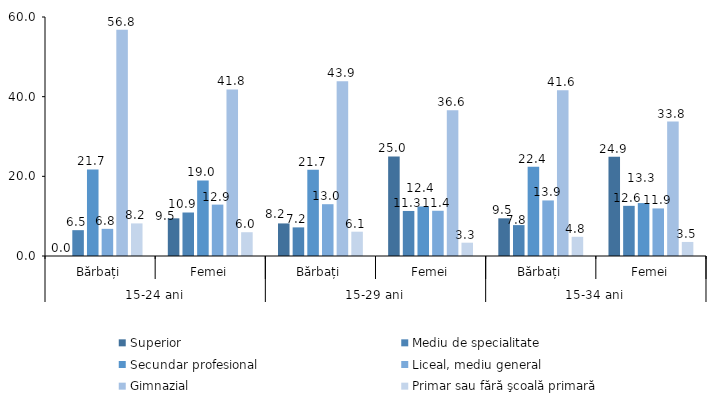
| Category | Superior | Mediu de specialitate | Secundar profesional | Liceal, mediu general | Gimnazial | Primar sau fără şcoală primară |
|---|---|---|---|---|---|---|
| 0 | 0 | 6.484 | 21.739 | 6.818 | 56.776 | 8.183 |
| 1 | 9.457 | 10.919 | 18.954 | 12.9 | 41.801 | 5.969 |
| 2 | 8.178 | 7.186 | 21.676 | 13.005 | 43.856 | 6.099 |
| 3 | 25.002 | 11.308 | 12.433 | 11.356 | 36.561 | 3.341 |
| 4 | 9.459 | 7.754 | 22.432 | 13.947 | 41.591 | 4.817 |
| 5 | 24.898 | 12.592 | 13.282 | 11.941 | 33.763 | 3.524 |